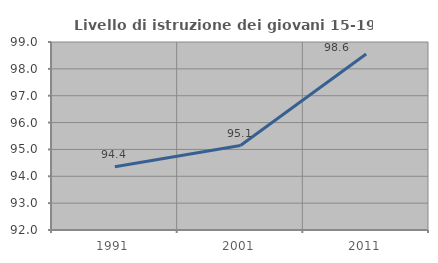
| Category | Livello di istruzione dei giovani 15-19 anni |
|---|---|
| 1991.0 | 94.355 |
| 2001.0 | 95.146 |
| 2011.0 | 98.551 |